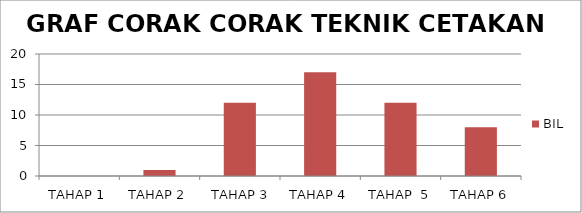
| Category | BIL |
|---|---|
| TAHAP 1 | 0 |
| TAHAP 2 | 1 |
|  TAHAP 3 | 12 |
| TAHAP 4 | 17 |
| TAHAP  5 | 12 |
| TAHAP 6 | 8 |